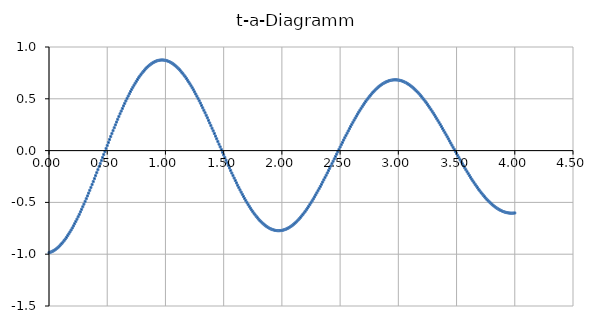
| Category | Series 0 |
|---|---|
| 0.0 | -0.985 |
| 0.01 | -0.982 |
| 0.02 | -0.977 |
| 0.03 | -0.972 |
| 0.04 | -0.966 |
| 0.05 | -0.959 |
| 0.06 | -0.951 |
| 0.07 | -0.942 |
| 0.08 | -0.932 |
| 0.09 | -0.921 |
| 0.1 | -0.909 |
| 0.11 | -0.897 |
| 0.12 | -0.883 |
| 0.13 | -0.869 |
| 0.14 | -0.854 |
| 0.15 | -0.838 |
| 0.16 | -0.821 |
| 0.17 | -0.804 |
| 0.18 | -0.786 |
| 0.19 | -0.767 |
| 0.2 | -0.747 |
| 0.21 | -0.727 |
| 0.22 | -0.706 |
| 0.23 | -0.684 |
| 0.24 | -0.662 |
| 0.25 | -0.639 |
| 0.26 | -0.615 |
| 0.27 | -0.592 |
| 0.28 | -0.567 |
| 0.29 | -0.542 |
| 0.3 | -0.517 |
| 0.31 | -0.491 |
| 0.32 | -0.464 |
| 0.33 | -0.438 |
| 0.34 | -0.411 |
| 0.35 | -0.383 |
| 0.36 | -0.355 |
| 0.37 | -0.327 |
| 0.38 | -0.299 |
| 0.39 | -0.271 |
| 0.4 | -0.242 |
| 0.41 | -0.213 |
| 0.42 | -0.184 |
| 0.43 | -0.155 |
| 0.44 | -0.126 |
| 0.45 | -0.096 |
| 0.46 | -0.067 |
| 0.47 | -0.038 |
| 0.48 | -0.009 |
| 0.49 | 0.02 |
| 0.5 | 0.05 |
| 0.51 | 0.078 |
| 0.52 | 0.107 |
| 0.53 | 0.136 |
| 0.54 | 0.164 |
| 0.55 | 0.192 |
| 0.56 | 0.22 |
| 0.57 | 0.248 |
| 0.58 | 0.275 |
| 0.59 | 0.302 |
| 0.6 | 0.329 |
| 0.61 | 0.355 |
| 0.62 | 0.381 |
| 0.63 | 0.406 |
| 0.64 | 0.431 |
| 0.65 | 0.456 |
| 0.66 | 0.48 |
| 0.67 | 0.503 |
| 0.68 | 0.526 |
| 0.69 | 0.548 |
| 0.7 | 0.57 |
| 0.71 | 0.591 |
| 0.72 | 0.611 |
| 0.73 | 0.631 |
| 0.74 | 0.65 |
| 0.75 | 0.669 |
| 0.76 | 0.686 |
| 0.77 | 0.703 |
| 0.78 | 0.72 |
| 0.790000000000001 | 0.735 |
| 0.8 | 0.75 |
| 0.810000000000001 | 0.764 |
| 0.82 | 0.777 |
| 0.83 | 0.789 |
| 0.84 | 0.801 |
| 0.850000000000001 | 0.812 |
| 0.860000000000001 | 0.822 |
| 0.87 | 0.831 |
| 0.88 | 0.839 |
| 0.890000000000001 | 0.846 |
| 0.900000000000001 | 0.853 |
| 0.910000000000001 | 0.859 |
| 0.92 | 0.863 |
| 0.930000000000001 | 0.867 |
| 0.940000000000001 | 0.871 |
| 0.950000000000001 | 0.873 |
| 0.960000000000001 | 0.874 |
| 0.970000000000001 | 0.875 |
| 0.980000000000001 | 0.874 |
| 0.990000000000001 | 0.873 |
| 1.0 | 0.871 |
| 1.01 | 0.868 |
| 1.02 | 0.864 |
| 1.03 | 0.86 |
| 1.04 | 0.854 |
| 1.05 | 0.848 |
| 1.06 | 0.841 |
| 1.07 | 0.833 |
| 1.08 | 0.824 |
| 1.09 | 0.815 |
| 1.1 | 0.805 |
| 1.11 | 0.794 |
| 1.12 | 0.782 |
| 1.13 | 0.769 |
| 1.14 | 0.756 |
| 1.15 | 0.742 |
| 1.16 | 0.727 |
| 1.17 | 0.712 |
| 1.18 | 0.696 |
| 1.19 | 0.679 |
| 1.2 | 0.662 |
| 1.21 | 0.644 |
| 1.22 | 0.626 |
| 1.23 | 0.607 |
| 1.24 | 0.587 |
| 1.25 | 0.567 |
| 1.26 | 0.546 |
| 1.27 | 0.525 |
| 1.28 | 0.503 |
| 1.29 | 0.481 |
| 1.3 | 0.459 |
| 1.31 | 0.436 |
| 1.32 | 0.413 |
| 1.33 | 0.389 |
| 1.34 | 0.365 |
| 1.35 | 0.341 |
| 1.36 | 0.317 |
| 1.37 | 0.292 |
| 1.38 | 0.267 |
| 1.39 | 0.242 |
| 1.4 | 0.216 |
| 1.41 | 0.191 |
| 1.42 | 0.165 |
| 1.43 | 0.139 |
| 1.44 | 0.114 |
| 1.45 | 0.088 |
| 1.46 | 0.062 |
| 1.47 | 0.036 |
| 1.48 | 0.01 |
| 1.49 | -0.016 |
| 1.5 | -0.041 |
| 1.51 | -0.067 |
| 1.52 | -0.092 |
| 1.53 | -0.118 |
| 1.54 | -0.143 |
| 1.55 | -0.168 |
| 1.56 | -0.192 |
| 1.57 | -0.217 |
| 1.58 | -0.241 |
| 1.59 | -0.265 |
| 1.6 | -0.288 |
| 1.61 | -0.312 |
| 1.62 | -0.335 |
| 1.63 | -0.357 |
| 1.64 | -0.379 |
| 1.65 | -0.401 |
| 1.66 | -0.422 |
| 1.67 | -0.443 |
| 1.68 | -0.463 |
| 1.69 | -0.483 |
| 1.7 | -0.502 |
| 1.71 | -0.521 |
| 1.72 | -0.539 |
| 1.73 | -0.556 |
| 1.74 | -0.573 |
| 1.75 | -0.589 |
| 1.76 | -0.605 |
| 1.77 | -0.62 |
| 1.78 | -0.635 |
| 1.79 | -0.648 |
| 1.8 | -0.662 |
| 1.81 | -0.674 |
| 1.82 | -0.686 |
| 1.83 | -0.697 |
| 1.84 | -0.707 |
| 1.85 | -0.717 |
| 1.86 | -0.725 |
| 1.87 | -0.733 |
| 1.88 | -0.741 |
| 1.89 | -0.747 |
| 1.9 | -0.753 |
| 1.91 | -0.758 |
| 1.92 | -0.763 |
| 1.93 | -0.766 |
| 1.94 | -0.769 |
| 1.95 | -0.771 |
| 1.96 | -0.773 |
| 1.97 | -0.773 |
| 1.98 | -0.773 |
| 1.99 | -0.772 |
| 2.0 | -0.77 |
| 2.01 | -0.768 |
| 2.02 | -0.764 |
| 2.03 | -0.76 |
| 2.04 | -0.756 |
| 2.05 | -0.75 |
| 2.06 | -0.744 |
| 2.07 | -0.737 |
| 2.08 | -0.729 |
| 2.09 | -0.721 |
| 2.1 | -0.712 |
| 2.11 | -0.702 |
| 2.12 | -0.692 |
| 2.13 | -0.681 |
| 2.14 | -0.669 |
| 2.15 | -0.657 |
| 2.16 | -0.644 |
| 2.17 | -0.631 |
| 2.18 | -0.617 |
| 2.19 | -0.602 |
| 2.2 | -0.587 |
| 2.21 | -0.571 |
| 2.22 | -0.555 |
| 2.23 | -0.538 |
| 2.24 | -0.52 |
| 2.25 | -0.503 |
| 2.26 | -0.485 |
| 2.27 | -0.466 |
| 2.28 | -0.447 |
| 2.29 | -0.427 |
| 2.29999999999999 | -0.408 |
| 2.30999999999999 | -0.387 |
| 2.31999999999999 | -0.367 |
| 2.32999999999999 | -0.346 |
| 2.33999999999999 | -0.325 |
| 2.34999999999999 | -0.304 |
| 2.35999999999999 | -0.282 |
| 2.36999999999999 | -0.26 |
| 2.37999999999999 | -0.238 |
| 2.38999999999999 | -0.216 |
| 2.39999999999999 | -0.193 |
| 2.40999999999999 | -0.171 |
| 2.41999999999999 | -0.148 |
| 2.42999999999999 | -0.126 |
| 2.43999999999999 | -0.103 |
| 2.44999999999999 | -0.08 |
| 2.45999999999999 | -0.057 |
| 2.46999999999999 | -0.034 |
| 2.47999999999999 | -0.011 |
| 2.48999999999999 | 0.011 |
| 2.49999999999999 | 0.034 |
| 2.50999999999999 | 0.057 |
| 2.51999999999999 | 0.079 |
| 2.52999999999999 | 0.102 |
| 2.53999999999999 | 0.124 |
| 2.54999999999999 | 0.146 |
| 2.55999999999999 | 0.168 |
| 2.56999999999999 | 0.19 |
| 2.57999999999999 | 0.211 |
| 2.58999999999999 | 0.232 |
| 2.59999999999999 | 0.253 |
| 2.60999999999999 | 0.273 |
| 2.61999999999999 | 0.294 |
| 2.62999999999999 | 0.314 |
| 2.63999999999999 | 0.333 |
| 2.64999999999999 | 0.352 |
| 2.65999999999999 | 0.371 |
| 2.66999999999999 | 0.389 |
| 2.67999999999999 | 0.407 |
| 2.68999999999999 | 0.425 |
| 2.69999999999999 | 0.442 |
| 2.70999999999999 | 0.458 |
| 2.71999999999999 | 0.475 |
| 2.72999999999999 | 0.49 |
| 2.73999999999999 | 0.505 |
| 2.74999999999999 | 0.52 |
| 2.75999999999999 | 0.534 |
| 2.76999999999998 | 0.547 |
| 2.77999999999998 | 0.56 |
| 2.78999999999998 | 0.572 |
| 2.79999999999998 | 0.584 |
| 2.80999999999998 | 0.595 |
| 2.81999999999998 | 0.605 |
| 2.82999999999998 | 0.615 |
| 2.83999999999998 | 0.624 |
| 2.84999999999998 | 0.633 |
| 2.85999999999998 | 0.64 |
| 2.86999999999998 | 0.648 |
| 2.87999999999998 | 0.654 |
| 2.88999999999998 | 0.66 |
| 2.89999999999998 | 0.665 |
| 2.90999999999998 | 0.67 |
| 2.91999999999998 | 0.674 |
| 2.92999999999998 | 0.677 |
| 2.93999999999998 | 0.68 |
| 2.94999999999998 | 0.682 |
| 2.95999999999998 | 0.683 |
| 2.96999999999998 | 0.683 |
| 2.97999999999998 | 0.683 |
| 2.98999999999998 | 0.682 |
| 2.99999999999998 | 0.681 |
| 3.00999999999998 | 0.679 |
| 3.01999999999998 | 0.676 |
| 3.02999999999998 | 0.672 |
| 3.03999999999998 | 0.668 |
| 3.04999999999998 | 0.664 |
| 3.05999999999998 | 0.658 |
| 3.06999999999998 | 0.652 |
| 3.07999999999998 | 0.645 |
| 3.08999999999998 | 0.638 |
| 3.09999999999998 | 0.63 |
| 3.10999999999998 | 0.622 |
| 3.11999999999998 | 0.613 |
| 3.12999999999998 | 0.603 |
| 3.13999999999998 | 0.593 |
| 3.14999999999998 | 0.582 |
| 3.15999999999998 | 0.571 |
| 3.16999999999998 | 0.559 |
| 3.17999999999998 | 0.546 |
| 3.18999999999998 | 0.533 |
| 3.19999999999998 | 0.52 |
| 3.20999999999998 | 0.506 |
| 3.21999999999998 | 0.492 |
| 3.22999999999997 | 0.477 |
| 3.23999999999997 | 0.462 |
| 3.24999999999997 | 0.446 |
| 3.25999999999997 | 0.43 |
| 3.26999999999997 | 0.413 |
| 3.27999999999997 | 0.397 |
| 3.28999999999997 | 0.379 |
| 3.29999999999997 | 0.362 |
| 3.30999999999997 | 0.344 |
| 3.31999999999997 | 0.326 |
| 3.32999999999997 | 0.308 |
| 3.33999999999997 | 0.289 |
| 3.34999999999997 | 0.27 |
| 3.35999999999997 | 0.251 |
| 3.36999999999997 | 0.232 |
| 3.37999999999997 | 0.212 |
| 3.38999999999997 | 0.193 |
| 3.39999999999997 | 0.173 |
| 3.40999999999997 | 0.153 |
| 3.41999999999997 | 0.133 |
| 3.42999999999997 | 0.113 |
| 3.43999999999997 | 0.093 |
| 3.44999999999997 | 0.073 |
| 3.45999999999997 | 0.052 |
| 3.46999999999997 | 0.032 |
| 3.47999999999997 | 0.012 |
| 3.48999999999997 | -0.008 |
| 3.49999999999997 | -0.028 |
| 3.50999999999997 | -0.048 |
| 3.51999999999997 | -0.068 |
| 3.52999999999997 | -0.088 |
| 3.53999999999997 | -0.108 |
| 3.54999999999997 | -0.127 |
| 3.55999999999997 | -0.146 |
| 3.56999999999997 | -0.166 |
| 3.57999999999997 | -0.185 |
| 3.58999999999997 | -0.203 |
| 3.59999999999997 | -0.222 |
| 3.60999999999997 | -0.24 |
| 3.61999999999997 | -0.258 |
| 3.62999999999997 | -0.275 |
| 3.63999999999997 | -0.293 |
| 3.64999999999997 | -0.31 |
| 3.65999999999997 | -0.326 |
| 3.66999999999997 | -0.343 |
| 3.67999999999997 | -0.359 |
| 3.68999999999997 | -0.374 |
| 3.69999999999996 | -0.389 |
| 3.70999999999996 | -0.404 |
| 3.71999999999996 | -0.418 |
| 3.72999999999996 | -0.432 |
| 3.73999999999996 | -0.445 |
| 3.74999999999996 | -0.458 |
| 3.75999999999996 | -0.47 |
| 3.76999999999996 | -0.482 |
| 3.77999999999996 | -0.494 |
| 3.78999999999996 | -0.504 |
| 3.79999999999996 | -0.515 |
| 3.80999999999996 | -0.525 |
| 3.81999999999996 | -0.534 |
| 3.82999999999996 | -0.543 |
| 3.83999999999996 | -0.551 |
| 3.84999999999996 | -0.558 |
| 3.85999999999996 | -0.565 |
| 3.86999999999996 | -0.572 |
| 3.87999999999996 | -0.578 |
| 3.88999999999996 | -0.583 |
| 3.89999999999996 | -0.588 |
| 3.90999999999996 | -0.592 |
| 3.91999999999996 | -0.595 |
| 3.92999999999996 | -0.598 |
| 3.93999999999996 | -0.601 |
| 3.94999999999996 | -0.602 |
| 3.95999999999996 | -0.603 |
| 3.96999999999996 | -0.604 |
| 3.97999999999996 | -0.604 |
| 3.98999999999996 | -0.603 |
| 3.99999999999996 | -0.602 |